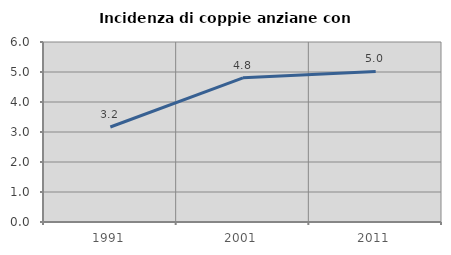
| Category | Incidenza di coppie anziane con figli |
|---|---|
| 1991.0 | 3.167 |
| 2001.0 | 4.806 |
| 2011.0 | 5.018 |